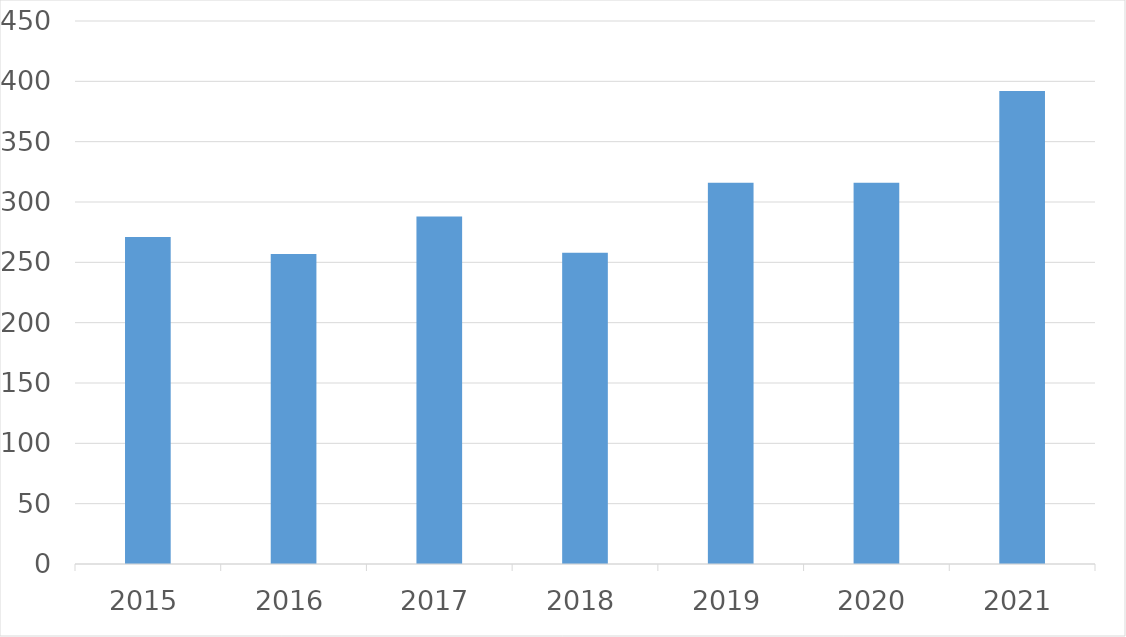
| Category | Series 0 |
|---|---|
| 2015 | 271 |
| 2016 | 257 |
| 2017 | 288 |
| 2018 | 258 |
| 2019 | 316 |
| 2020 | 316 |
| 2021 | 392 |